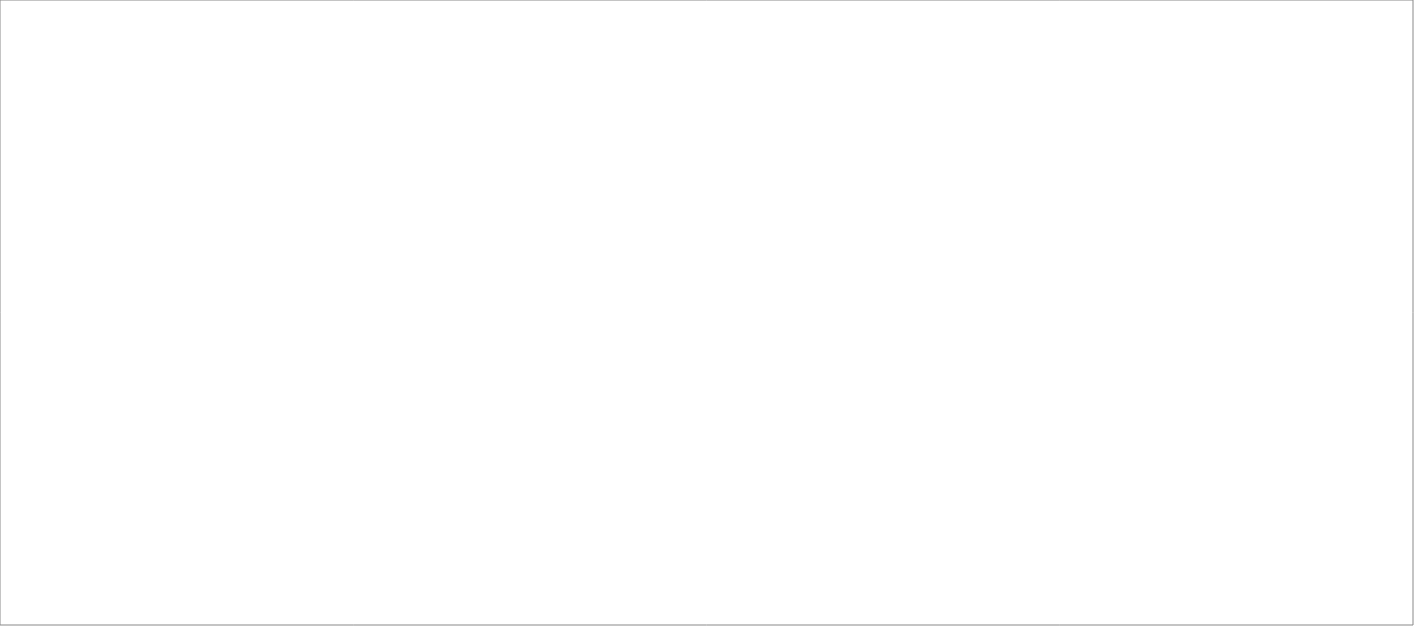
| Category | Total |
|---|---|
| Poolia Sverige AB | 85 |
| Clockwork Bemanning & Rekrytering AB | 83 |
| Randstad AB | 67.632 |
| Experis AB | 49.6 |
| Source Executive Recruitment Sweden AB | 25 |